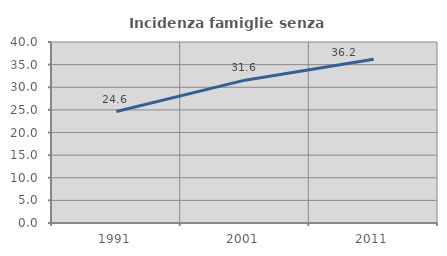
| Category | Incidenza famiglie senza nuclei |
|---|---|
| 1991.0 | 24.624 |
| 2001.0 | 31.57 |
| 2011.0 | 36.168 |